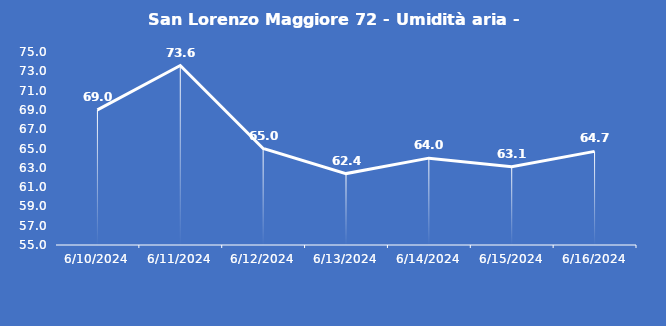
| Category | San Lorenzo Maggiore 72 - Umidità aria - Grezzo (%) |
|---|---|
| 6/10/24 | 69 |
| 6/11/24 | 73.6 |
| 6/12/24 | 65 |
| 6/13/24 | 62.4 |
| 6/14/24 | 64 |
| 6/15/24 | 63.1 |
| 6/16/24 | 64.7 |